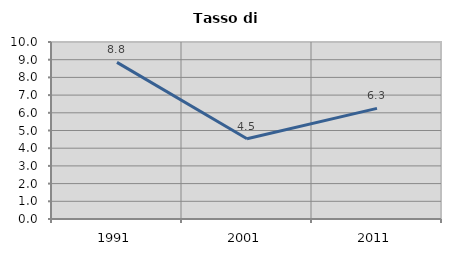
| Category | Tasso di disoccupazione   |
|---|---|
| 1991.0 | 8.848 |
| 2001.0 | 4.538 |
| 2011.0 | 6.25 |